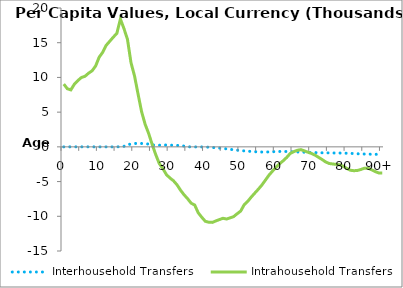
| Category | Interhousehold Transfers | Intrahousehold Transfers |
|---|---|---|
| 0 | 0 | 9041.562 |
|  | 0 | 8375.056 |
| 2 | 0 | 8206.972 |
| 3 | 0 | 9032.658 |
| 4 | 0 | 9559.871 |
| 5 | 0 | 9991.024 |
| 6 | 0 | 10165.3 |
| 7 | 0 | 10608.65 |
| 8 | 0 | 10949.73 |
| 9 | 0 | 11647.49 |
| 10 | 0 | 12912.28 |
| 11 | 0 | 13615.6 |
| 12 | 0 | 14631.22 |
| 13 | 0 | 15214.84 |
| 14 | 0 | 15801.8 |
| 15 | 0 | 16348.94 |
| 16 | 22.589 | 18409.78 |
| 17 | 74.56 | 17051.48 |
| 18 | 324.773 | 15491.65 |
| 19 | 395.682 | 12121.32 |
| 20 | 465.463 | 10209.97 |
| 21 | 543.088 | 7593.329 |
| 22 | 482.678 | 5052.534 |
| 23 | 455.86 | 3245.365 |
| 24 | 402.419 | 1920.965 |
| 25 | 279.888 | 314.919 |
| 26 | 238.224 | -1130.598 |
| 27 | 241.307 | -2411.425 |
| 28 | 249.258 | -3126.678 |
| 29 | 265.078 | -3989.319 |
| 30 | 239.012 | -4486.265 |
| 31 | 236.396 | -4882.353 |
| 32 | 210.258 | -5464.414 |
| 33 | 167.292 | -6244.245 |
| 34 | 111.829 | -6906.994 |
| 35 | 21.876 | -7466.799 |
| 36 | -8.287 | -8113.462 |
| 37 | -10.608 | -8377.267 |
| 38 | -7.721 | -9494.173 |
| 39 | -6.413 | -10143.65 |
| 40 | -26.47 | -10719.78 |
| 41 | -48.066 | -10860.93 |
| 42 | -85.883 | -10877.97 |
| 43 | -135.594 | -10665.42 |
| 44 | -176.408 | -10471.12 |
| 45 | -225.793 | -10288.27 |
| 46 | -294.167 | -10395.15 |
| 47 | -362.702 | -10229.02 |
| 48 | -420.528 | -10048.29 |
| 49 | -480.717 | -9635.285 |
| 50 | -544.825 | -9246.104 |
| 51 | -584.729 | -8323.967 |
| 52 | -631.334 | -7843.477 |
| 53 | -663.223 | -7221.165 |
| 54 | -699.749 | -6653.387 |
| 55 | -726.872 | -6092.821 |
| 56 | -743.063 | -5486.245 |
| 57 | -740.77 | -4781.844 |
| 58 | -731.99 | -4073.607 |
| 59 | -703.796 | -3487.604 |
| 60 | -673.733 | -2934.319 |
| 61 | -663.329 | -2428.033 |
| 62 | -665.877 | -2005.413 |
| 63 | -671.847 | -1528.817 |
| 64 | -690.218 | -948.44 |
| 65 | -716.134 | -686.523 |
| 66 | -731.328 | -497.279 |
| 67 | -746.427 | -397.665 |
| 68 | -772.725 | -579.334 |
| 69 | -795.14 | -773.931 |
| 70 | -800.678 | -950.159 |
| 71 | -823.884 | -1190.94 |
| 72 | -847.166 | -1507.303 |
| 73 | -855.653 | -1818.879 |
| 74 | -864.134 | -2170.866 |
| 75 | -873.514 | -2394.87 |
| 76 | -879.737 | -2464.572 |
| 77 | -886.448 | -2527.955 |
| 78 | -893.924 | -2580.036 |
| 79 | -901.438 | -2796.219 |
| 80 | -923.101 | -3116.961 |
| 81 | -943.024 | -3371.108 |
| 82 | -961.541 | -3433.488 |
| 83 | -996.604 | -3400.918 |
| 84 | -1019.137 | -3252.646 |
| 85 | -1035.73 | -3067.655 |
| 86 | -1049.259 | -3063.905 |
| 87 | -1061.403 | -3305.375 |
| 88 | -1072.851 | -3555.283 |
| 89 | -1084.103 | -3755.677 |
| 90+ | -1095.449 | -3770.234 |